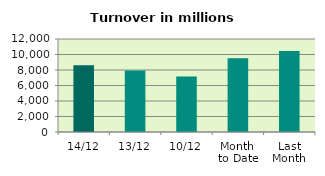
| Category | Series 0 |
|---|---|
| 14/12 | 8628.128 |
| 13/12 | 7926.733 |
| 10/12 | 7153.819 |
| Month 
to Date | 9521.597 |
| Last
Month | 10449.431 |